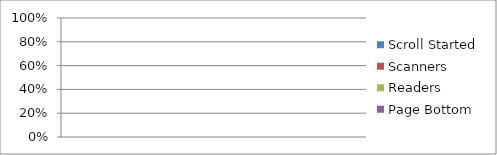
| Category | Scroll Started | Scanners | Readers | Page Bottom |
|---|---|---|---|---|
| 0 | 0 | 0 | 0 | 0 |